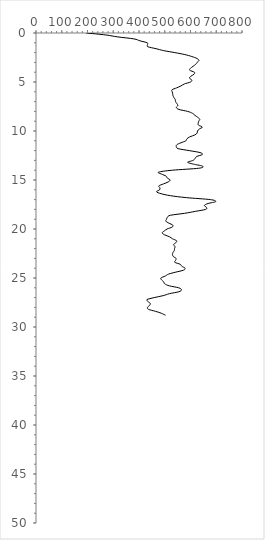
| Category | Series 0 |
|---|---|
| 195.0 | 0 |
| 271.0 | 0.2 |
| 318.0 | 0.4 |
| 380.0 | 0.6 |
| 404.0 | 0.8 |
| 432.0 | 1 |
| 433.0 | 1.2 |
| 434.0 | 1.4 |
| 466.0 | 1.6 |
| 496.0 | 1.8 |
| 539.0 | 2 |
| 578.0 | 2.2 |
| 605.0 | 2.4 |
| 625.0 | 2.6 |
| 633.0 | 2.8 |
| 626.0 | 3 |
| 620.0 | 3.2 |
| 610.0 | 3.4 |
| 600.0 | 3.6 |
| 597.0 | 3.8 |
| 615.0 | 4 |
| 614.0 | 4.2 |
| 602.0 | 4.4 |
| 596.0 | 4.6 |
| 605.0 | 4.8 |
| 600.0 | 5 |
| 576.0 | 5.2 |
| 563.0 | 5.4 |
| 546.0 | 5.6 |
| 528.0 | 5.8 |
| 529.0 | 6 |
| 531.0 | 6.2 |
| 532.0 | 6.4 |
| 536.0 | 6.6 |
| 541.0 | 6.8 |
| 542.0 | 7 |
| 547.0 | 7.2 |
| 551.0 | 7.4 |
| 545.0 | 7.6 |
| 555.0 | 7.8 |
| 589.0 | 8 |
| 608.0 | 8.2 |
| 617.0 | 8.4 |
| 628.0 | 8.6 |
| 636.0 | 8.8 |
| 632.0 | 9 |
| 630.0 | 9.2 |
| 631.0 | 9.4 |
| 646.0 | 9.6 |
| 634.0 | 9.8 |
| 627.0 | 10 |
| 626.0 | 10.2 |
| 617.0 | 10.4 |
| 597.0 | 10.6 |
| 586.0 | 10.8 |
| 582.0 | 11 |
| 563.0 | 11.2 |
| 547.0 | 11.4 |
| 545.0 | 11.6 |
| 552.0 | 11.8 |
| 595.0 | 12 |
| 637.0 | 12.2 |
| 646.0 | 12.4 |
| 624.0 | 12.6 |
| 618.0 | 12.8 |
| 610.0 | 13 |
| 589.0 | 13.2 |
| 615.0 | 13.4 |
| 648.0 | 13.6 |
| 632.0 | 13.8 |
| 530.0 | 14 |
| 476.0 | 14.2 |
| 488.0 | 14.4 |
| 505.0 | 14.6 |
| 510.0 | 14.8 |
| 521.0 | 15 |
| 513.0 | 15.2 |
| 495.0 | 15.4 |
| 477.0 | 15.6 |
| 481.0 | 15.8 |
| 480.0 | 16 |
| 468.0 | 16.2 |
| 486.0 | 16.4 |
| 522.0 | 16.6 |
| 584.0 | 16.8 |
| 677.0 | 17 |
| 698.0 | 17.2 |
| 668.0 | 17.4 |
| 654.0 | 17.6 |
| 662.0 | 17.8 |
| 659.0 | 18 |
| 619.0 | 18.2 |
| 577.0 | 18.4 |
| 522.0 | 18.6 |
| 510.0 | 18.8 |
| 507.0 | 19 |
| 504.0 | 19.2 |
| 516.0 | 19.4 |
| 531.0 | 19.6 |
| 529.0 | 19.8 |
| 509.0 | 20 |
| 498.0 | 20.2 |
| 490.0 | 20.4 |
| 500.0 | 20.6 |
| 519.0 | 20.8 |
| 530.0 | 21 |
| 546.0 | 21.2 |
| 543.0 | 21.4 |
| 534.0 | 21.6 |
| 540.0 | 21.8 |
| 538.0 | 22 |
| 537.0 | 22.2 |
| 532.0 | 22.4 |
| 530.0 | 22.6 |
| 533.0 | 22.8 |
| 544.0 | 23 |
| 542.0 | 23.2 |
| 539.0 | 23.4 |
| 560.0 | 23.6 |
| 566.0 | 23.8 |
| 579.0 | 24 |
| 573.0 | 24.2 |
| 543.0 | 24.4 |
| 515.0 | 24.6 |
| 502.0 | 24.8 |
| 485.0 | 25 |
| 488.0 | 25.2 |
| 496.0 | 25.4 |
| 500.0 | 25.6 |
| 518.0 | 25.8 |
| 554.0 | 26 |
| 565.0 | 26.2 |
| 555.0 | 26.4 |
| 518.0 | 26.6 |
| 494.0 | 26.8 |
| 459.0 | 27 |
| 431.0 | 27.2 |
| 435.0 | 27.4 |
| 444.0 | 27.6 |
| 441.0 | 27.8 |
| 433.0 | 28 |
| 437.0 | 28.2 |
| 464.0 | 28.4 |
| 487.0 | 28.6 |
| 503.0 | 28.8 |